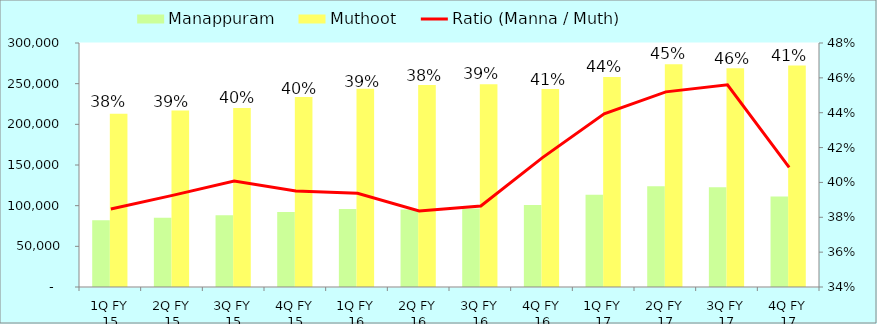
| Category | Manappuram | Muthoot |
|---|---|---|
| 1Q FY 15 | 81975 | 213054 |
| 2Q FY 15 | 85180 | 216971 |
| 3Q FY 15 | 88236 | 220117 |
| 4Q FY 15 | 92245 | 233499 |
| 1Q FY 16 | 95924 | 243605 |
| 2Q FY 16 | 95239 | 248250 |
| 3Q FY 16 | 96392 | 249409 |
| 4Q FY 16 | 100806 | 243355 |
| 1Q FY 17 | 113451 | 258226 |
| 2Q FY 17 | 123827 | 273980 |
| 3Q FY 17 | 122672 | 269025 |
| 4Q FY 17 | 111245 | 272199 |